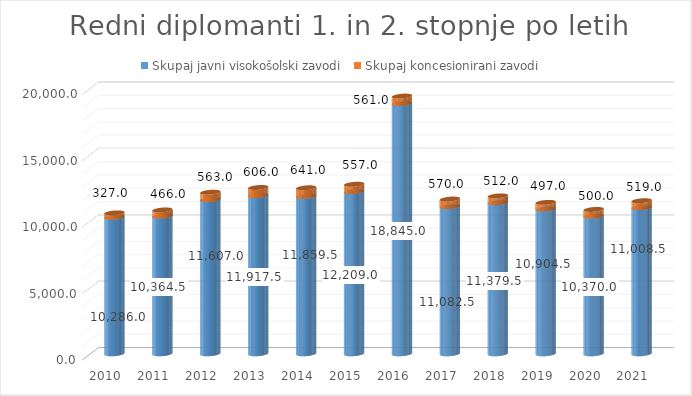
| Category | Skupaj javni visokošolski zavodi | Skupaj koncesionirani zavodi |
|---|---|---|
| 2010.0 | 10286 | 327 |
| 2011.0 | 10364.5 | 466 |
| 2012.0 | 11607 | 563 |
| 2013.0 | 11917.5 | 606 |
| 2014.0 | 11859.5 | 641 |
| 2015.0 | 12209 | 557 |
| 2016.0 | 18845 | 561 |
| 2017.0 | 11082.5 | 570 |
| 2018.0 | 11379.5 | 512 |
| 2019.0 | 10904.5 | 497 |
| 2020.0 | 10370 | 500 |
| 2021.0 | 11008.5 | 519 |